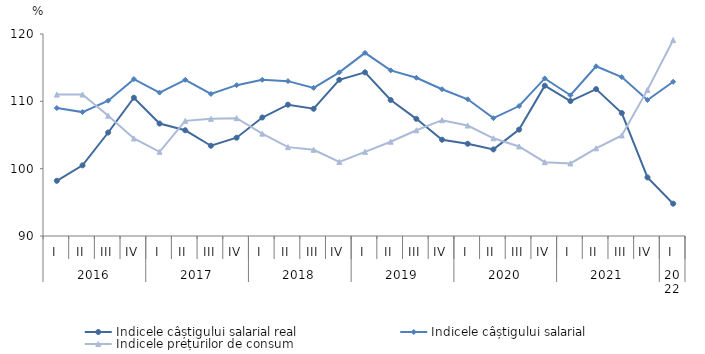
| Category | Indicele câștigului salarial real | Indicele câștigului salarial | Indicele prețurilor de consum |
|---|---|---|---|
| 0 | 98.2 | 109 | 111 |
| 1 | 100.491 | 108.4 | 111.01 |
| 2 | 105.369 | 110.1 | 107.87 |
| 3 | 110.537 | 113.3 | 104.49 |
| 4 | 106.7 | 111.3 | 102.5 |
| 5 | 105.7 | 113.2 | 107.1 |
| 6 | 103.4 | 111.1 | 107.4 |
| 7 | 104.6 | 112.4 | 107.5 |
| 8 | 107.6 | 113.2 | 105.2 |
| 9 | 109.5 | 113 | 103.2 |
| 10 | 108.9 | 112 | 102.8 |
| 11 | 113.2 | 114.3 | 101 |
| 12 | 114.3 | 117.2 | 102.5 |
| 13 | 110.2 | 114.6 | 104 |
| 14 | 107.4 | 113.5 | 105.7 |
| 15 | 104.3 | 111.8 | 107.2 |
| 16 | 103.7 | 110.3 | 106.4 |
| 17 | 102.861 | 107.5 | 104.51 |
| 18 | 105.8 | 109.3 | 103.3 |
| 19 | 112.322 | 113.4 | 100.96 |
| 20 | 110.042 | 110.9 | 100.78 |
| 21 | 111.816 | 115.2 | 103.026 |
| 22 | 108.263 | 113.6 | 104.93 |
| 23 | 98.7 | 110.2 | 111.7 |
| 24 | 94.8 | 112.9 | 119.1 |